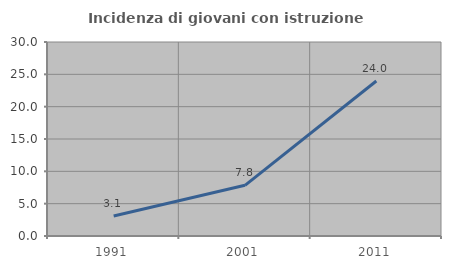
| Category | Incidenza di giovani con istruzione universitaria |
|---|---|
| 1991.0 | 3.081 |
| 2001.0 | 7.835 |
| 2011.0 | 23.964 |